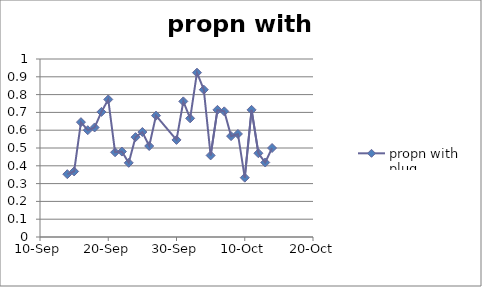
| Category | propn with plug |
|---|---|
| 38244.0 | 0.353 |
| 38245.0 | 0.368 |
| 38246.0 | 0.645 |
| 38247.0 | 0.6 |
| 38248.0 | 0.615 |
| 38249.0 | 0.703 |
| 38250.0 | 0.773 |
| 38251.0 | 0.476 |
| 38252.0 | 0.48 |
| 38253.0 | 0.417 |
| 38254.0 | 0.561 |
| 38255.0 | 0.59 |
| 38256.0 | 0.511 |
| 38257.0 | 0.682 |
| 38260.0 | 0.545 |
| 38261.0 | 0.762 |
| 38262.0 | 0.667 |
| 38263.0 | 0.923 |
| 38264.0 | 0.828 |
| 38265.0 | 0.458 |
| 38266.0 | 0.714 |
| 38267.0 | 0.706 |
| 38268.0 | 0.567 |
| 38269.0 | 0.579 |
| 38270.0 | 0.333 |
| 38271.0 | 0.714 |
| 38272.0 | 0.471 |
| 38273.0 | 0.419 |
| 38274.0 | 0.5 |